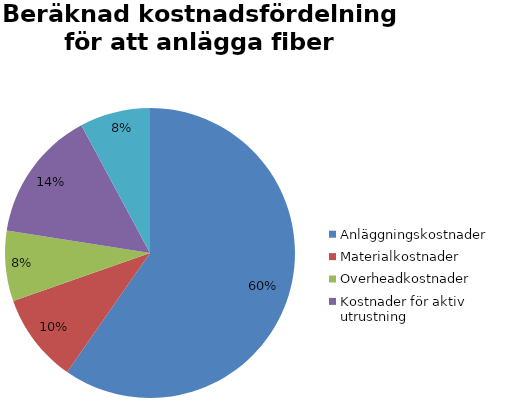
| Category | Series 0 |
|---|---|
| Anläggningskostnader | 1140000 |
| Materialkostnader | 190000 |
| Overheadkostnader | 150000 |
| Kostnader för aktiv utrustning | 280000 |
| Kostnader för markintrång | 150000 |